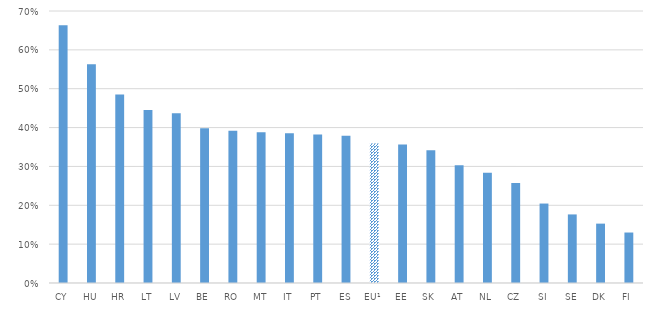
| Category | Investing in ICT |
|---|---|
| CY | 0.663 |
| HU | 0.563 |
| HR | 0.485 |
| LT | 0.445 |
| LV | 0.437 |
| BE | 0.398 |
| RO | 0.392 |
| MT | 0.388 |
| IT | 0.385 |
| PT | 0.382 |
| ES | 0.379 |
| EU¹ | 0.359 |
| EE | 0.357 |
| SK | 0.341 |
| AT | 0.303 |
| NL | 0.284 |
| CZ | 0.257 |
| SI | 0.204 |
| SE | 0.176 |
| DK | 0.153 |
| FI | 0.13 |